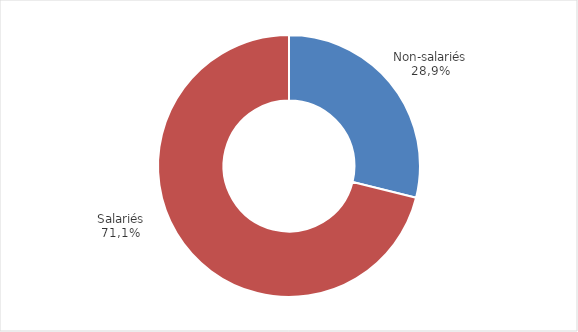
| Category | Series 0 |
|---|---|
| Non-salariés | 438.557 |
| Salariés | 1078.725 |